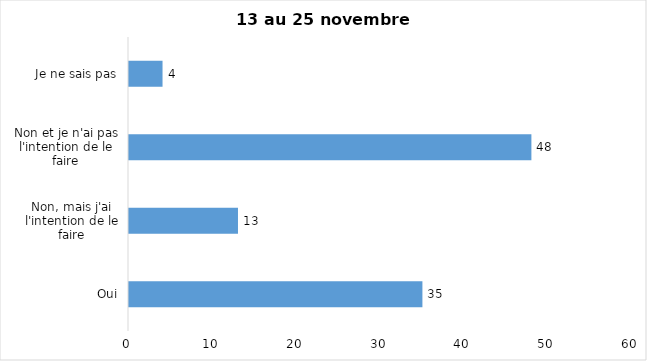
| Category | Series 0 |
|---|---|
| Oui | 35 |
| Non, mais j'ai l'intention de le faire | 13 |
| Non et je n'ai pas l'intention de le faire | 48 |
| Je ne sais pas | 4 |